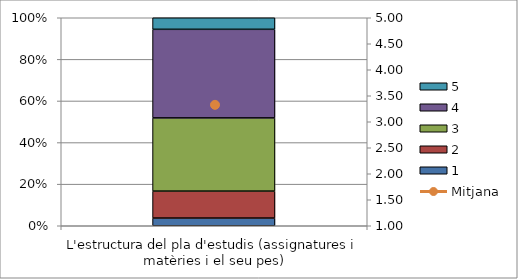
| Category | 1 | 2 | 3 | 4 | 5 |
|---|---|---|---|---|---|
| L'estructura del pla d'estudis (assignatures i matèries i el seu pes) | 2 | 7 | 19 | 23 | 3 |